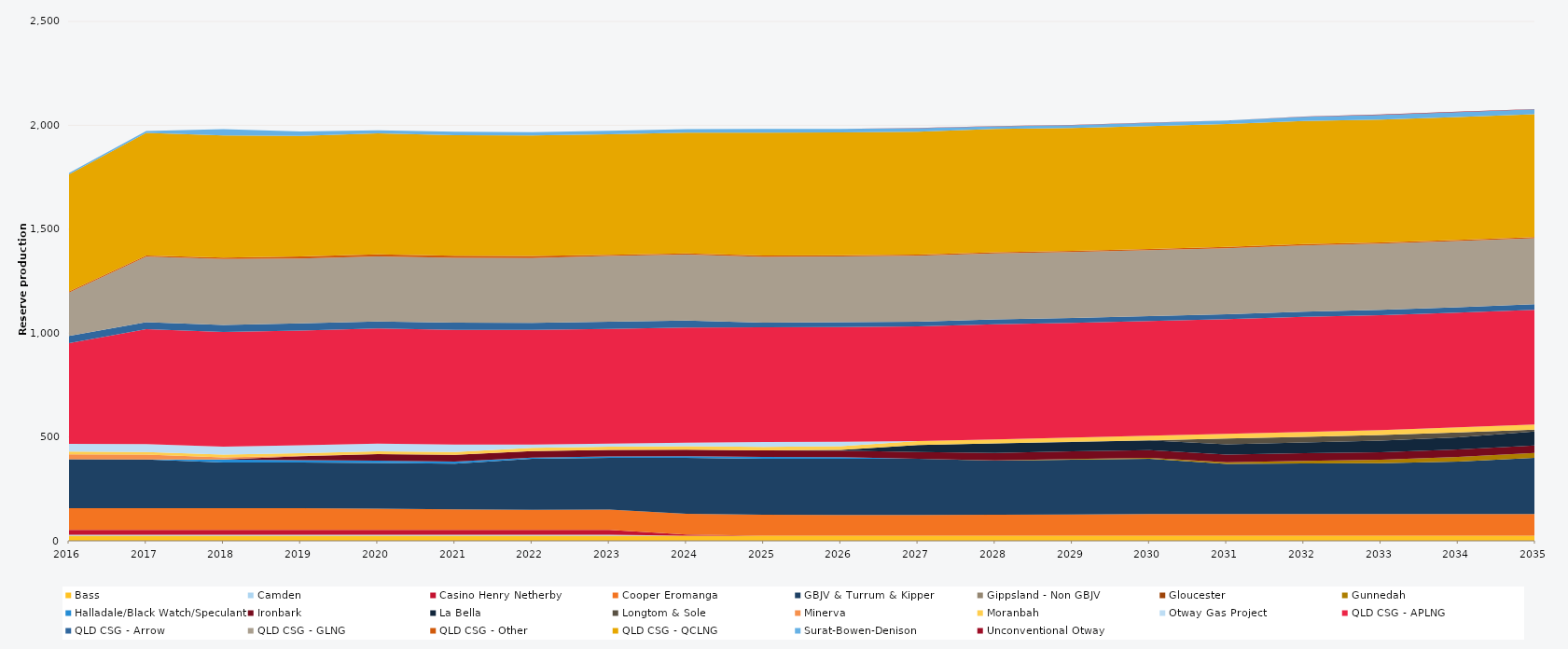
| Category | Bass | Camden | Casino Henry Netherby | Cooper Eromanga | GBJV & Turrum & Kipper | Gippsland - Non GBJV | Gloucester | Gunnedah | Halladale/Black Watch/Speculant | Ironbark | La Bella | Longtom & Sole | Minerva | Moranbah | Otway Gas Project | QLD CSG - APLNG | QLD CSG - Arrow | QLD CSG - GLNG | QLD CSG - Other | QLD CSG - QCLNG | Surat-Bowen-Denison | Unconventional Otway |
|---|---|---|---|---|---|---|---|---|---|---|---|---|---|---|---|---|---|---|---|---|---|---|
| 2016 | 24.522 | 5 | 23.12 | 105 | 235.041 | 0 | 0 | 0 | 0 | 0 | 0 | 0 | 23.79 | 12.859 | 38 | 484.594 | 34.038 | 209.001 | 5.856 | 563.547 | 5.945 | 0 |
| 2017 | 24.455 | 5 | 23.12 | 105 | 233.892 | 0 | 0 | 0 | 0 | 0 | 0 | 0 | 23.725 | 12.863 | 38 | 552.245 | 33.945 | 315.709 | 5.84 | 589.493 | 9.566 | 0 |
| 2018 | 24.455 | 5 | 23.12 | 105 | 220 | 0 | 0 | 0 | 14.421 | 0 | 0 | 0 | 9.902 | 13.029 | 38 | 552.245 | 33.945 | 317.904 | 5.84 | 588.867 | 30 | 0 |
| 2019 | 24.455 | 5 | 23.12 | 105 | 220 | 0 | 0 | 0 | 10.95 | 18.25 | 0 | 0 | 2.858 | 12.796 | 38 | 552.245 | 33.945 | 312.037 | 10.403 | 579.711 | 22.137 | 0 |
| 2020 | 24.522 | 5 | 23.12 | 101.977 | 220 | 0 | 0 | 0 | 10.95 | 31.587 | 0 | 0 | 0.475 | 12.768 | 38 | 553.758 | 34.038 | 312.824 | 10.419 | 581.442 | 15.26 | 0 |
| 2021 | 24.455 | 5 | 23.12 | 98.518 | 220 | 0 | 0 | 0 | 10.95 | 31.51 | 0 | 0 | 0 | 13.526 | 36.482 | 552.245 | 33.945 | 311.967 | 10.403 | 580.143 | 16.54 | 0 |
| 2022 | 24.455 | 5 | 23.12 | 96.855 | 245.927 | 0 | 0 | 0 | 5.702 | 31.391 | 0 | 0 | 0 | 15.305 | 15.24 | 552.245 | 33.945 | 311.905 | 10.403 | 579.646 | 16.273 | 0 |
| 2023 | 24.455 | 5 | 23.12 | 97.871 | 249.552 | 0 | 0 | 0 | 5.676 | 31.38 | 0 | 0 | 0 | 16.282 | 14.891 | 552.245 | 33.945 | 316.633 | 5.84 | 579.627 | 16.783 | 0 |
| 2024 | 24.522 | 0 | 5.3 | 99.942 | 270 | 0 | 0 | 0 | 7.629 | 31.066 | 0 | 0 | 0 | 16.806 | 17.598 | 553.758 | 34.038 | 317.367 | 5.856 | 580.633 | 17.31 | 0 |
| 2025 | 24.455 | 0 | 0 | 100.749 | 270 | 0 | 0 | 0.116 | 8.483 | 31.419 | 0 | 0 | 0 | 17.285 | 23.555 | 552.245 | 22.077 | 316.806 | 5.84 | 591.794 | 18.03 | 0 |
| 2026 | 24.455 | 0 | 0 | 100.411 | 270 | 0 | 0 | 0.255 | 7.239 | 31.425 | 3.836 | 0 | 0 | 17.534 | 21.841 | 552.245 | 22.876 | 316.704 | 5.84 | 591.753 | 15.837 | 0 |
| 2027 | 24.455 | 0 | 0 | 100.276 | 270 | 0 | 0 | 0.725 | 0 | 31.535 | 34.637 | 0 | 0 | 18.159 | 0 | 552.245 | 23.167 | 316.867 | 5.84 | 591.694 | 16.247 | 0.834 |
| 2028 | 24.522 | 0 | 0 | 100.609 | 261.09 | 0 | 0 | 1.261 | 0 | 35.754 | 45.94 | 0 | 0 | 19.008 | 0 | 553.758 | 23.513 | 317.838 | 5.856 | 593.235 | 13.159 | 1.077 |
| 2029 | 24.455 | 0 | 0 | 102.858 | 263.426 | 0 | 0 | 3.505 | 0 | 36.5 | 45.453 | 0.639 | 0 | 20.36 | 0 | 552.245 | 23.397 | 316.91 | 5.84 | 591.622 | 13.566 | 1.283 |
| 2030 | 24.455 | 0 | 0 | 105 | 265.076 | 0 | 0 | 5.326 | 0 | 36.5 | 46.948 | 0.73 | 0 | 21.622 | 0 | 552.245 | 23.644 | 317.293 | 5.84 | 591.579 | 15.96 | 1.339 |
| 2031 | 24.455 | 0 | 0 | 105 | 240.435 | 0 | 0 | 8.705 | 0 | 36.5 | 49.585 | 27.375 | 0 | 22.567 | 0 | 552.245 | 24.211 | 317.568 | 5.84 | 591.53 | 16.681 | 0.772 |
| 2032 | 24.522 | 0 | 0 | 105 | 243.268 | 0 | 0 | 12.378 | 0 | 36.6 | 51.643 | 27.45 | 0 | 23.484 | 0 | 553.758 | 25.31 | 318.7 | 5.856 | 593.07 | 19.764 | 1.328 |
| 2033 | 24.455 | 0 | 0 | 105 | 244.715 | 0 | 0 | 16.159 | 0 | 36.5 | 55.219 | 27.375 | 0 | 23.992 | 0 | 552.245 | 26.325 | 318.169 | 5.84 | 591.435 | 22.846 | 1.739 |
| 2034 | 24.455 | 0 | 0 | 105 | 252.516 | 0 | 0 | 21.553 | 0 | 36.5 | 58.382 | 22.975 | 0 | 24.563 | 0 | 552.245 | 26.511 | 318.356 | 5.84 | 591.394 | 23.74 | 1.71 |
| 2035 | 24.455 | 0 | 0 | 105 | 270 | 0 | 0 | 23.754 | 0 | 36.5 | 66.374 | 9.338 | 0 | 24.813 | 0 | 552.245 | 26.426 | 317.84 | 5.84 | 591.053 | 23.872 | 0.918 |